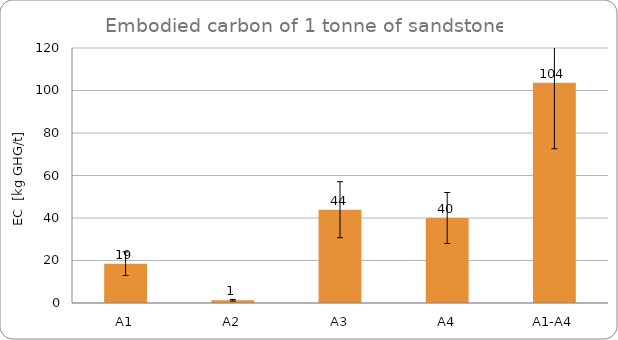
| Category | Series 0 |
|---|---|
| A1 | 18.5 |
| A2 | 1.29 |
| A3 | 43.9 |
| A4 | 40 |
| A1-A4 | 103.69 |